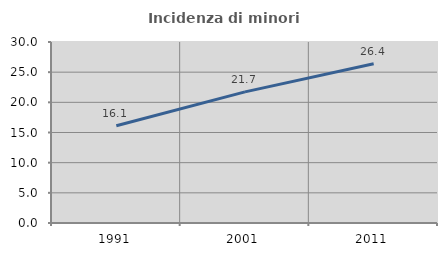
| Category | Incidenza di minori stranieri |
|---|---|
| 1991.0 | 16.129 |
| 2001.0 | 21.739 |
| 2011.0 | 26.4 |